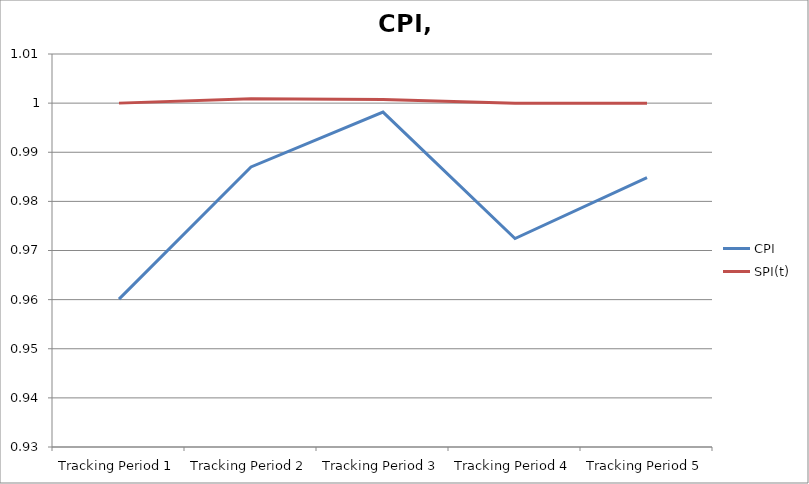
| Category | CPI | SPI(t) |
|---|---|---|
| Tracking Period 1 | 0.96 | 1 |
| Tracking Period 2 | 0.987 | 1.001 |
| Tracking Period 3 | 0.998 | 1.001 |
| Tracking Period 4 | 0.972 | 1 |
| Tracking Period 5 | 0.985 | 1 |